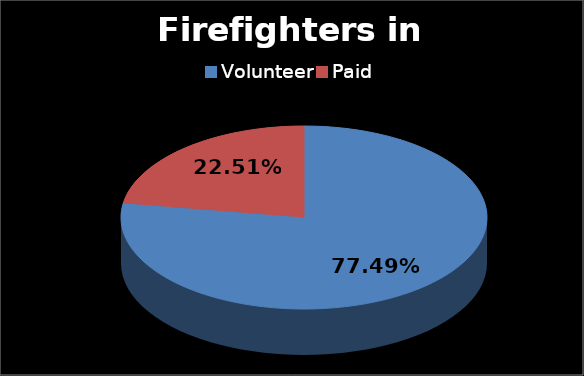
| Category | Series 0 |
|---|---|
| Volunteer | 0.775 |
| Paid | 0.225 |